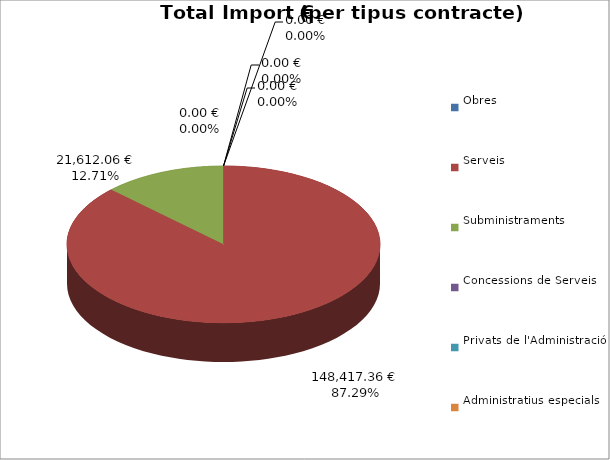
| Category | Total preu
(amb IVA) |
|---|---|
| Obres | 0 |
| Serveis | 148417.36 |
| Subministraments | 21612.06 |
| Concessions de Serveis | 0 |
| Privats de l'Administració | 0 |
| Administratius especials | 0 |